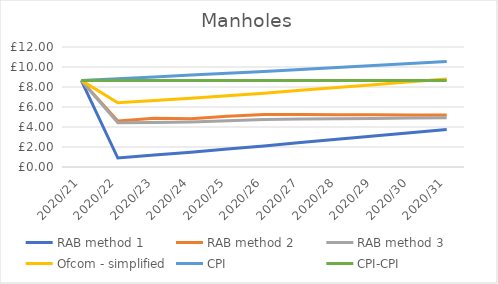
| Category | RAB method 1 | RAB method 2 | RAB method 3 | Ofcom - simplified | CPI | CPI-CPI |
|---|---|---|---|---|---|---|
| 2020/21 | 8.66 | 8.66 | 8.66 | 8.66 | 8.66 | 8.66 |
| 2020/22 | 0.897 | 4.605 | 4.427 | 6.421 | 8.833 | 8.66 |
| 2020/23 | 1.19 | 4.884 | 4.447 | 6.653 | 9.01 | 8.66 |
| 2020/24 | 1.484 | 4.836 | 4.495 | 6.884 | 9.19 | 8.66 |
| 2020/25 | 1.79 | 5.064 | 4.619 | 7.128 | 9.374 | 8.66 |
| 2020/26 | 2.11 | 5.26 | 4.755 | 7.385 | 9.561 | 8.66 |
| 2020/27 | 2.44 | 5.247 | 4.791 | 7.67 | 9.753 | 8.66 |
| 2020/28 | 2.768 | 5.234 | 4.827 | 7.953 | 9.948 | 8.66 |
| 2020/29 | 3.095 | 5.221 | 4.862 | 8.235 | 10.147 | 8.66 |
| 2020/30 | 3.421 | 5.208 | 4.898 | 8.514 | 10.35 | 8.66 |
| 2020/31 | 3.746 | 5.196 | 4.934 | 8.79 | 10.556 | 8.66 |